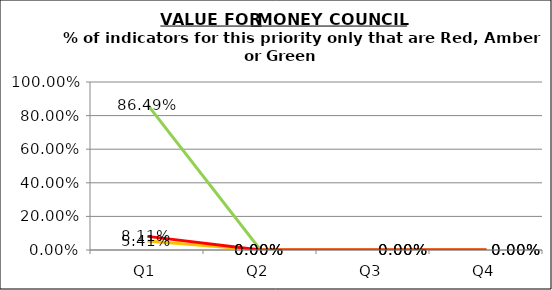
| Category | Green | Amber | Red |
|---|---|---|---|
| Q1 | 0.865 | 0.054 | 0.081 |
| Q2 | 0 | 0 | 0 |
| Q3 | 0 | 0 | 0 |
| Q4 | 0 | 0 | 0 |